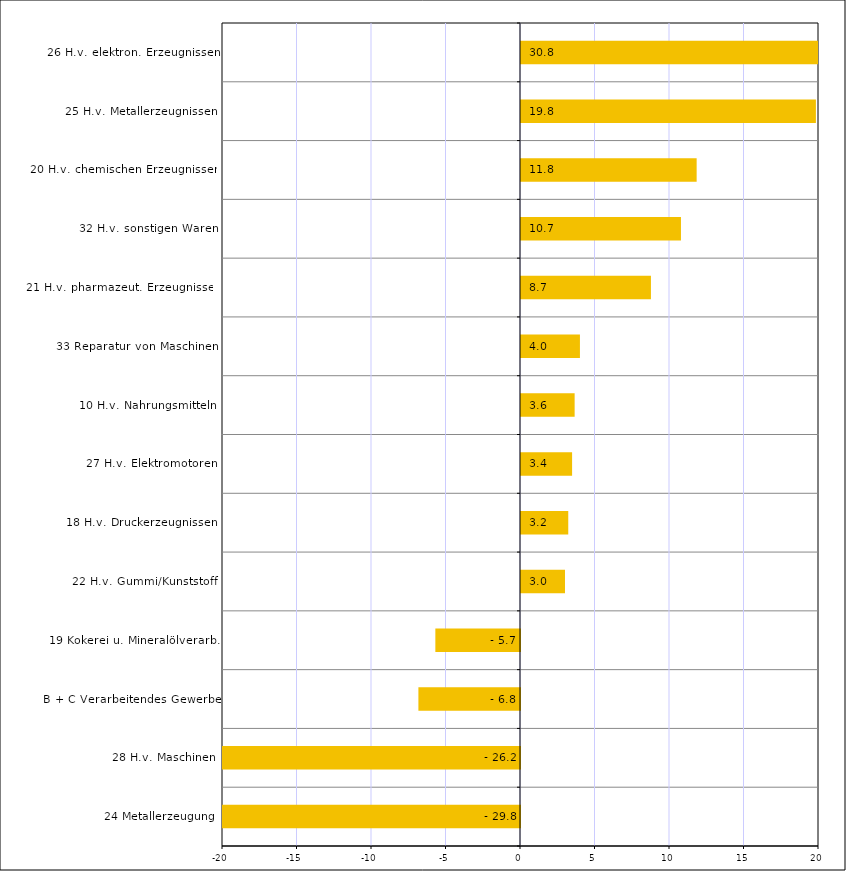
| Category | Series 0 |
|---|---|
| 24 Metallerzeugung | -29.84 |
| 28 H.v. Maschinen | -26.189 |
| B + C Verarbeitendes Gewerbe | -6.818 |
| 19 Kokerei u. Mineralölverarb. | -5.681 |
| 22 H.v. Gummi/Kunststoff | 2.952 |
| 18 H.v. Druckerzeugnissen | 3.172 |
| 27 H.v. Elektromotoren | 3.429 |
| 10 H.v. Nahrungsmitteln | 3.6 |
| 33 Reparatur von Maschinen | 3.955 |
| 21 H.v. pharmazeut. Erzeugnissen | 8.72 |
| 32 H.v. sonstigen Waren | 10.736 |
| 20 H.v. chemischen Erzeugnissen | 11.788 |
| 25 H.v. Metallerzeugnissen | 19.793 |
| 26 H.v. elektron. Erzeugnissen | 30.824 |